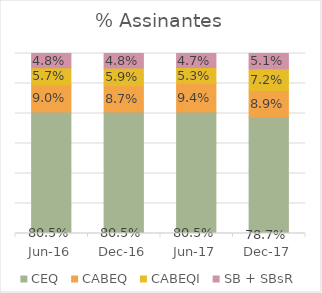
| Category | CEQ | CABEQ | CABEQI | SB + SBsR |
|---|---|---|---|---|
| 2016-06-01 | 0.805 | 0.09 | 0.057 | 0.048 |
| 2016-12-01 | 0.805 | 0.087 | 0.059 | 0.048 |
| 2017-06-01 | 0.805 | 0.094 | 0.053 | 0.047 |
| 2017-12-01 | 0.787 | 0.089 | 0.072 | 0.051 |